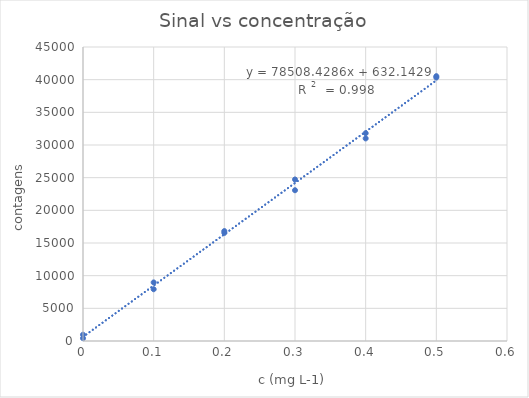
| Category | Series 0 |
|---|---|
| 0.0 | 423 |
| 0.1 | 7924 |
| 0.2 | 16545 |
| 0.3 | 23076 |
| 0.4 | 31808 |
| 0.5 | 40534 |
| 0.0 | 962 |
| 0.1 | 8965 |
| 0.2 | 16824 |
| 0.3 | 24722 |
| 0.4 | 31006 |
| 0.5 | 40322 |